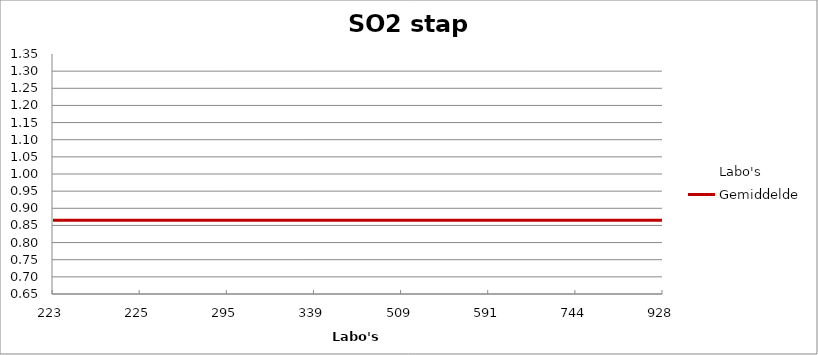
| Category | Labo's | Gemiddelde |
|---|---|---|
| 223.0 | 0.861 | 0.865 |
| 225.0 | 0.697 | 0.865 |
| 295.0 | 0.866 | 0.865 |
| 339.0 | 0.771 | 0.865 |
| 509.0 | 0.842 | 0.865 |
| 591.0 | 0.915 | 0.865 |
| 744.0 | 0.927 | 0.865 |
| 928.0 | 1.341 | 0.865 |